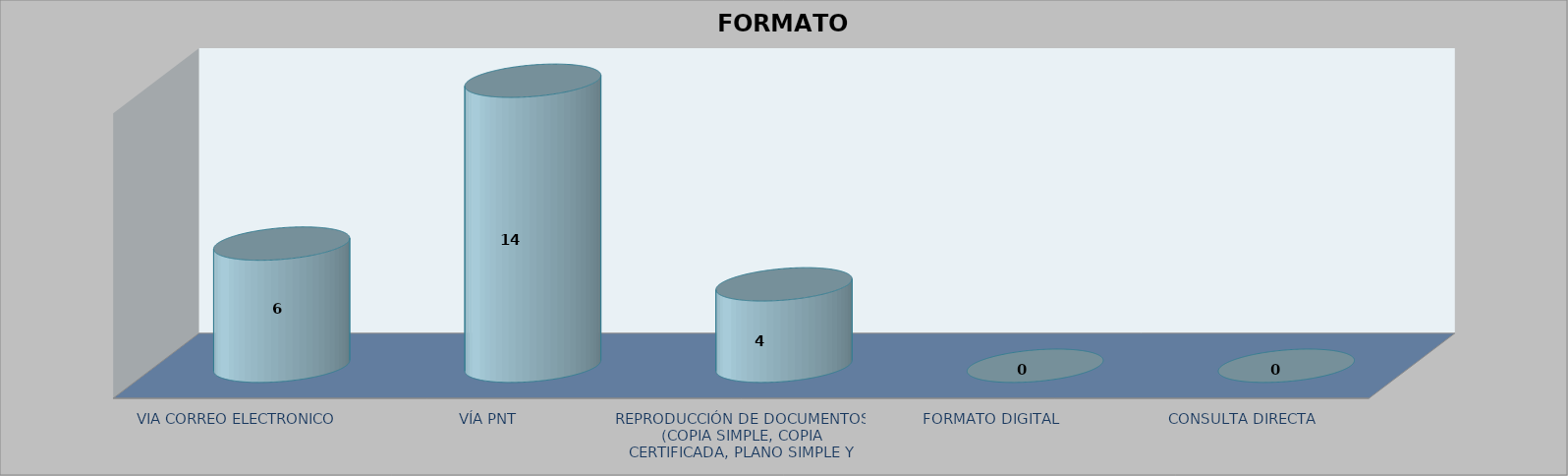
| Category |        FORMATO SOLICITADO | Series 1 | Series 2 |
|---|---|---|---|
| VIA CORREO ELECTRONICO |  |  | 6 |
| VÍA PNT |  |  | 14 |
| REPRODUCCIÓN DE DOCUMENTOS (COPIA SIMPLE, COPIA CERTIFICADA, PLANO SIMPLE Y PLANO CERTIFICADO) |  |  | 4 |
| FORMATO DIGITAL |  |  | 0 |
| CONSULTA DIRECTA |  |  | 0 |